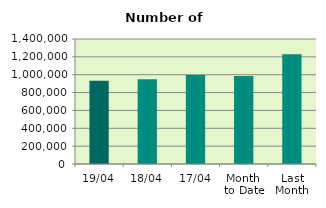
| Category | Series 0 |
|---|---|
| 19/04 | 931358 |
| 18/04 | 948610 |
| 17/04 | 995456 |
| Month 
to Date | 986952.727 |
| Last
Month | 1228285.652 |